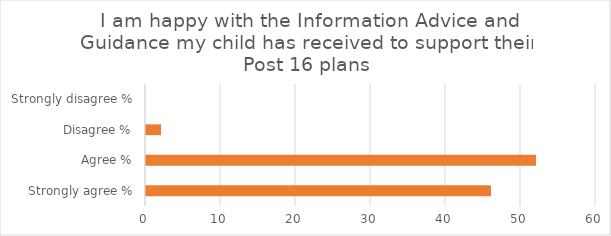
| Category | Series 1 |
|---|---|
| Strongly agree % | 46 |
| Agree % | 52 |
| Disagree % | 2 |
| Strongly disagree % | 0 |